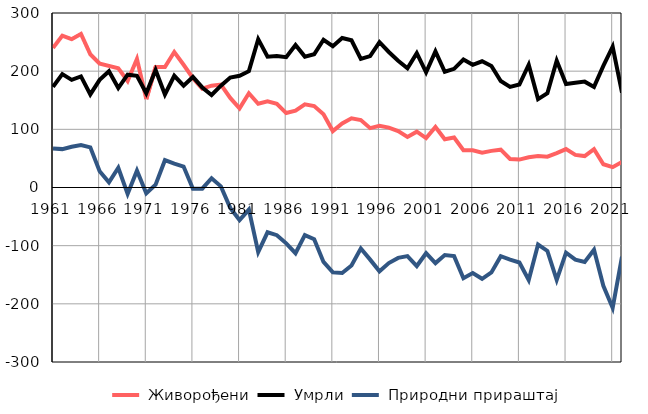
| Category |  Живорођени |  Умрли |  Природни прираштај |
|---|---|---|---|
| 1961.0 | 240 | 173 | 67 |
| 1962.0 | 261 | 195 | 66 |
| 1963.0 | 255 | 185 | 70 |
| 1964.0 | 264 | 191 | 73 |
| 1965.0 | 229 | 160 | 69 |
| 1966.0 | 213 | 185 | 28 |
| 1967.0 | 209 | 200 | 9 |
| 1968.0 | 205 | 171 | 34 |
| 1969.0 | 183 | 194 | -11 |
| 1970.0 | 221 | 192 | 29 |
| 1971.0 | 152 | 162 | -10 |
| 1972.0 | 207 | 202 | 5 |
| 1973.0 | 207 | 160 | 47 |
| 1974.0 | 233 | 192 | 41 |
| 1975.0 | 211 | 175 | 36 |
| 1976.0 | 188 | 190 | -2 |
| 1977.0 | 170 | 172 | -2 |
| 1978.0 | 175 | 159 | 16 |
| 1979.0 | 177 | 175 | 2 |
| 1980.0 | 154 | 189 | -35 |
| 1981.0 | 136 | 192 | -56 |
| 1982.0 | 162 | 200 | -38 |
| 1983.0 | 144 | 255 | -111 |
| 1984.0 | 148 | 225 | -77 |
| 1985.0 | 144 | 226 | -82 |
| 1986.0 | 128 | 224 | -96 |
| 1987.0 | 132 | 245 | -113 |
| 1988.0 | 143 | 225 | -82 |
| 1989.0 | 140 | 229 | -89 |
| 1990.0 | 126 | 254 | -128 |
| 1991.0 | 97 | 243 | -146 |
| 1992.0 | 110 | 257 | -147 |
| 1993.0 | 119 | 253 | -134 |
| 1994.0 | 116 | 221 | -105 |
| 1995.0 | 102 | 226 | -124 |
| 1996.0 | 106 | 250 | -144 |
| 1997.0 | 103 | 233 | -130 |
| 1998.0 | 97 | 218 | -121 |
| 1999.0 | 87 | 205 | -118 |
| 2000.0 | 96 | 231 | -135 |
| 2001.0 | 85 | 198 | -113 |
| 2002.0 | 104 | 234 | -130 |
| 2003.0 | 83 | 199 | -116 |
| 2004.0 | 86 | 204 | -118 |
| 2005.0 | 64 | 220 | -156 |
| 2006.0 | 64 | 211 | -147 |
| 2007.0 | 60 | 217 | -157 |
| 2008.0 | 63 | 209 | -146 |
| 2009.0 | 65 | 183 | -118 |
| 2010.0 | 49 | 173 | -124 |
| 2011.0 | 48 | 177 | -129 |
| 2012.0 | 52 | 211 | -159 |
| 2013.0 | 54 | 152 | -98 |
| 2014.0 | 53 | 162 | -109 |
| 2015.0 | 59 | 218 | -159 |
| 2016.0 | 66 | 178 | -112 |
| 2017.0 | 56 | 180 | -124 |
| 2018.0 | 54 | 182 | -128 |
| 2019.0 | 66 | 173 | -107 |
| 2020.0 | 40 | 209 | -169 |
| 2021.0 | 35 | 242 | -207 |
| 2022.0 | 44 | 163 | -119 |